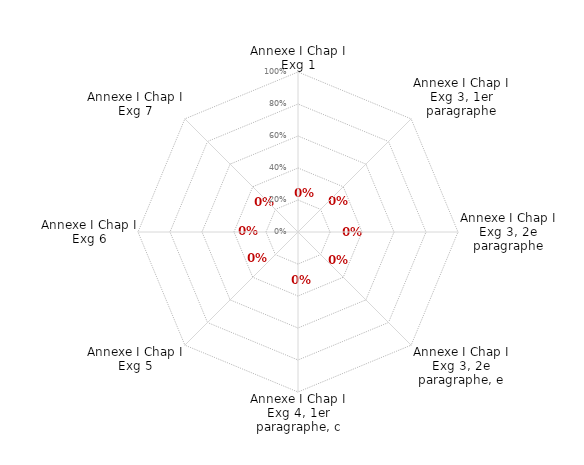
| Category | annexe1 chap1 |
|---|---|
| Annexe I Chap I Exg 1 | 0 |
| Annexe I Chap I Exg 3, 1er paragraphe | 0 |
| Annexe I Chap I Exg 3, 2e paragraphe | 0 |
| Annexe I Chap I Exg 3, 2e paragraphe, e | 0 |
| Annexe I Chap I Exg 4, 1er paragraphe, c | 0 |
| Annexe I Chap I Exg 5 | 0 |
| Annexe I Chap I Exg 6 | 0 |
| Annexe I Chap I Exg 7 | 0 |